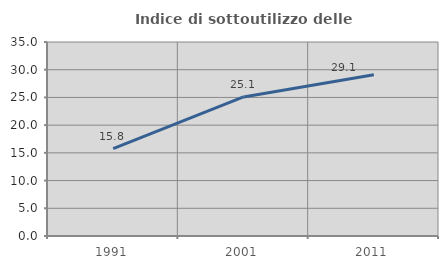
| Category | Indice di sottoutilizzo delle abitazioni  |
|---|---|
| 1991.0 | 15.774 |
| 2001.0 | 25.089 |
| 2011.0 | 29.095 |